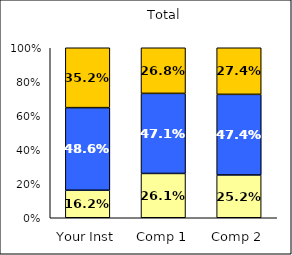
| Category | Low Academic Adjustment | Average Academic Adjustment | High Academic Adjustment |
|---|---|---|---|
| Your Inst | 0.162 | 0.486 | 0.352 |
| Comp 1 | 0.261 | 0.471 | 0.268 |
| Comp 2 | 0.252 | 0.474 | 0.274 |